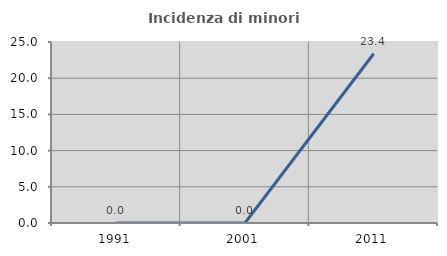
| Category | Incidenza di minori stranieri |
|---|---|
| 1991.0 | 0 |
| 2001.0 | 0 |
| 2011.0 | 23.377 |